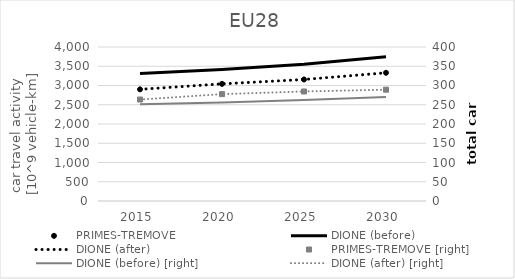
| Category | PRIMES-TREMOVE | DIONE (before) | DIONE (after) |
|---|---|---|---|
| 2015.0 | 2900.125 | 3313.6 | 2900.099 |
| 2020.0 | 3042.5 | 3413.931 | 3042.394 |
| 2025.0 | 3156.151 | 3552.54 | 3156.041 |
| 2030.0 | 3330.066 | 3743.721 | 3330.021 |